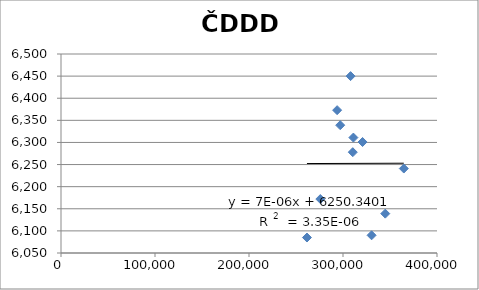
| Category | Series 0 |
|---|---|
| 261666.0 | 6085 |
| 275876.0 | 6172 |
| 293762.0 | 6373 |
| 297030.0 | 6339 |
| 308073.31075306085 | 6450 |
| 311064.0 | 6311 |
| 310422.0 | 6278 |
| 320806.0 | 6301 |
| 330409.0 | 6090 |
| 344980.0 | 6139 |
| 364688.0 | 6241 |